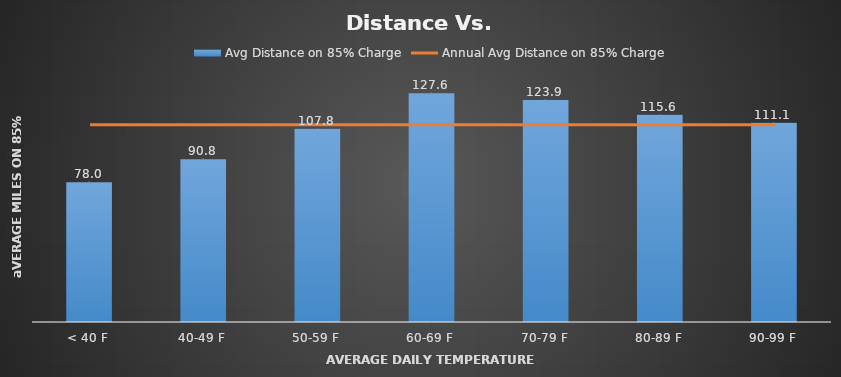
| Category | Avg Distance on 85% Charge |
|---|---|
| < 40 F | 78.001 |
| 40-49 F | 90.763 |
| 50-59 F | 107.822 |
| 60-69 F | 127.558 |
| 70-79 F | 123.872 |
| 80-89 F | 115.554 |
| 90-99 F | 111.133 |